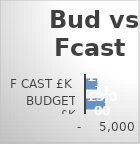
| Category | Series 0 |
|---|---|
| Budget £k | 3000 |
| F cast £k | 1810.79 |